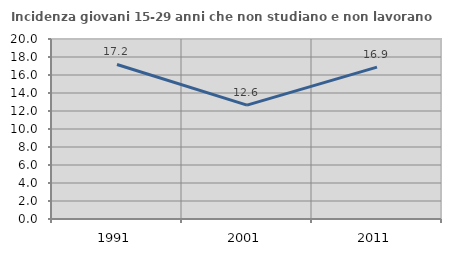
| Category | Incidenza giovani 15-29 anni che non studiano e non lavorano  |
|---|---|
| 1991.0 | 17.169 |
| 2001.0 | 12.65 |
| 2011.0 | 16.875 |